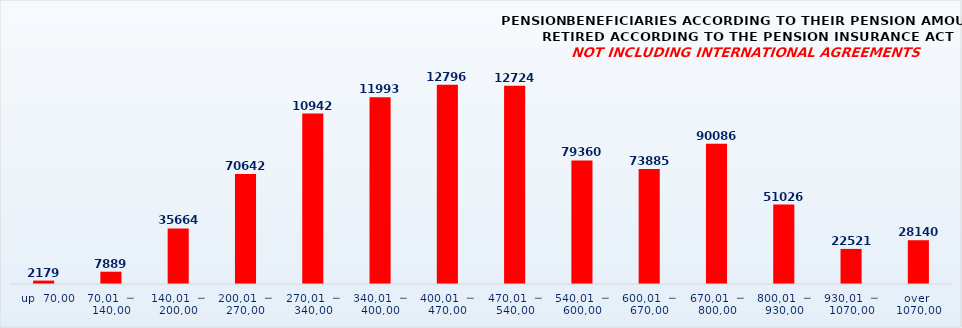
| Category | PENSION BENEFICIARIES ACCORDING TO TYPES AND AMOUNTS OF PENSION, RETIRED ACCORDING TO THE PENSION INSURANCE ACT
NOT INCLUDING INTERNATIONAL AGREEMENTS |
|---|---|
|   up  70,00 | 2179 |
| 70,01  ─  140,00 | 7889 |
| 140,01  ─  200,00 | 35664 |
| 200,01  ─  270,00 | 70642 |
| 270,01  ─  340,00 | 109427 |
| 340,01  ─  400,00 | 119931 |
| 400,01  ─  470,00 | 127967 |
| 470,01  ─  540,00 | 127245 |
| 540,01  ─  600,00 | 79360 |
| 600,01  ─  670,00 | 73885 |
| 670,01  ─  800,00 | 90086 |
| 800,01  ─  930,00 | 51026 |
| 930,01  ─  1070,00 | 22521 |
| over  1070,00 | 28140 |